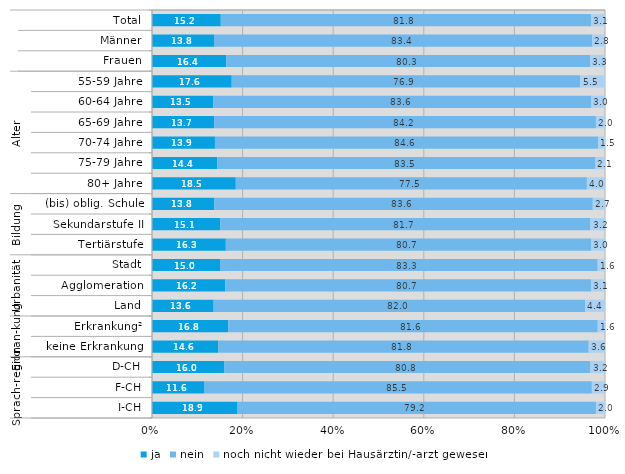
| Category | ja | nein | noch nicht wieder bei Hausärztin/-arzt gewesen |
|---|---|---|---|
| 0 | 15.2 | 81.8 | 3.1 |
| 1 | 13.8 | 83.4 | 2.8 |
| 2 | 16.4 | 80.3 | 3.3 |
| 3 | 17.6 | 76.9 | 5.5 |
| 4 | 13.5 | 83.6 | 3 |
| 5 | 13.7 | 84.2 | 2 |
| 6 | 13.9 | 84.6 | 1.5 |
| 7 | 14.4 | 83.5 | 2.1 |
| 8 | 18.5 | 77.5 | 4 |
| 9 | 13.8 | 83.6 | 2.7 |
| 10 | 15.1 | 81.7 | 3.2 |
| 11 | 16.3 | 80.7 | 3 |
| 12 | 15 | 83.3 | 1.6 |
| 13 | 16.2 | 80.7 | 3.1 |
| 14 | 13.6 | 82 | 4.4 |
| 15 | 16.8 | 81.6 | 1.6 |
| 16 | 14.6 | 81.8 | 3.6 |
| 17 | 16 | 80.8 | 3.2 |
| 18 | 11.6 | 85.5 | 2.9 |
| 19 | 18.9 | 79.2 | 2 |